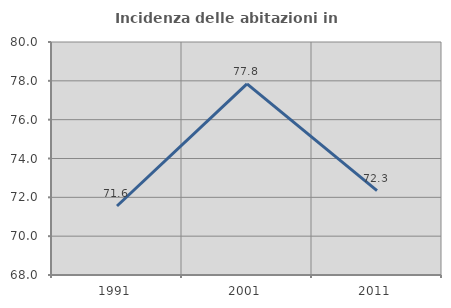
| Category | Incidenza delle abitazioni in proprietà  |
|---|---|
| 1991.0 | 71.554 |
| 2001.0 | 77.839 |
| 2011.0 | 72.345 |